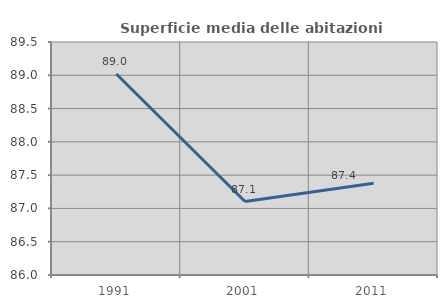
| Category | Superficie media delle abitazioni occupate |
|---|---|
| 1991.0 | 89.019 |
| 2001.0 | 87.104 |
| 2011.0 | 87.379 |